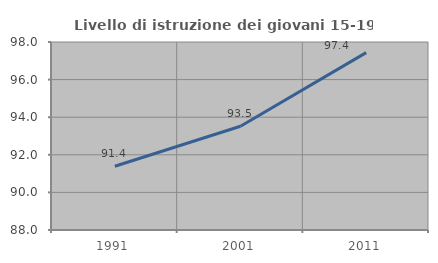
| Category | Livello di istruzione dei giovani 15-19 anni |
|---|---|
| 1991.0 | 91.393 |
| 2001.0 | 93.519 |
| 2011.0 | 97.436 |